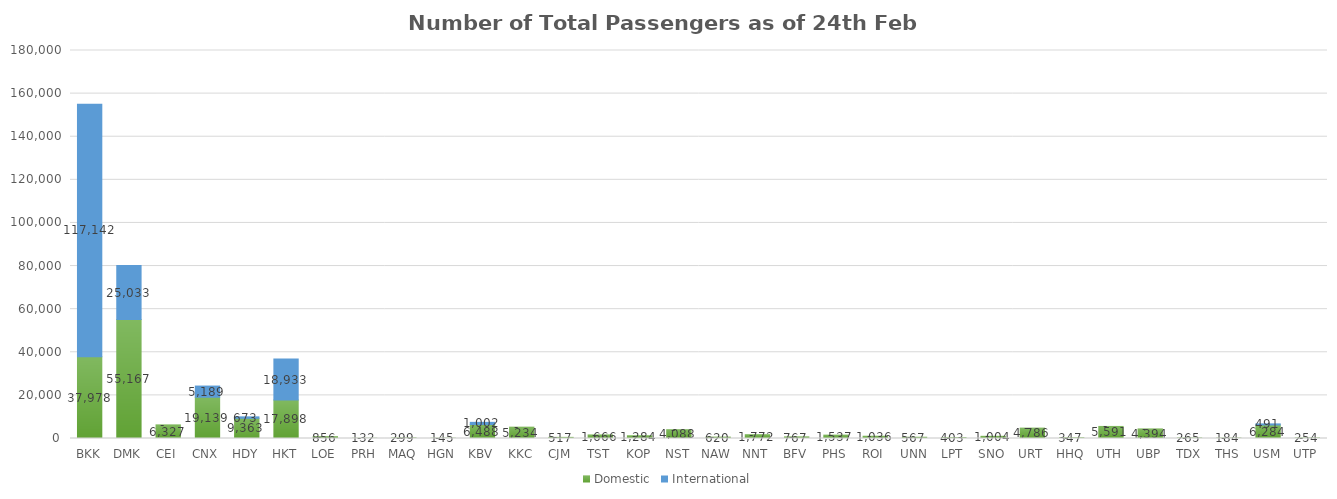
| Category | Domestic | International |
|---|---|---|
| BKK | 37978 | 117142 |
| DMK | 55167 | 25033 |
| CEI | 6327 | 0 |
| CNX | 19139 | 5189 |
| HDY | 9363 | 673 |
| HKT | 17898 | 18933 |
| LOE | 856 | 0 |
| PRH | 132 | 0 |
| MAQ | 299 | 0 |
| HGN | 145 | 0 |
| KBV | 6488 | 1002 |
| KKC | 5234 | 0 |
| CJM | 517 | 0 |
| TST | 1666 | 0 |
| KOP | 1284 | 0 |
| NST | 4088 | 0 |
| NAW | 620 | 0 |
| NNT | 1772 | 0 |
| BFV | 767 | 0 |
| PHS | 1537 | 0 |
| ROI | 1036 | 0 |
| UNN | 567 | 0 |
| LPT | 403 | 0 |
| SNO | 1004 | 0 |
| URT | 4786 | 0 |
| HHQ | 347 | 0 |
| UTH | 5591 | 0 |
| UBP | 4394 | 0 |
| TDX | 265 | 0 |
| THS | 184 | 0 |
| USM | 6284 | 491 |
| UTP | 254 | 0 |